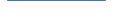
| Category | Series 0 |
|---|---|
| 0 | 111 |
| 1 | 109 |
| 2 | 120 |
| 3 | 113 |
| 4 | 116 |
| 5 | 100 |
| 6 | 105 |
| 7 | 103 |
| 8 | 100 |